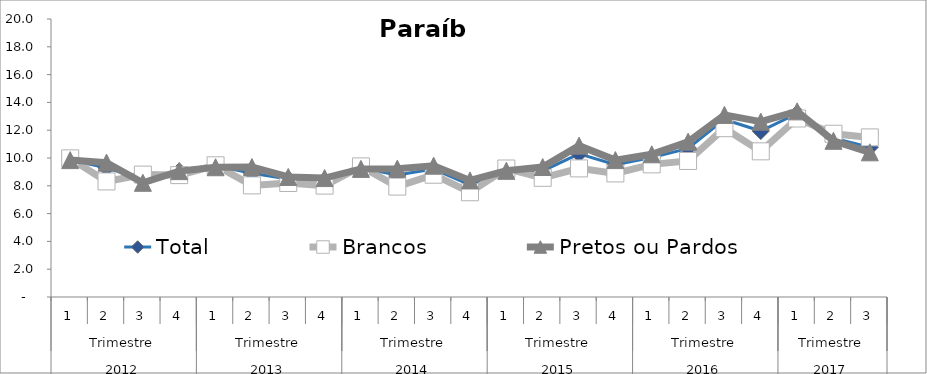
| Category | Total | Brancos | Pretos ou Pardos |
|---|---|---|---|
| 0 | 9.86 | 9.975 | 9.848 |
| 1 | 9.291 | 8.313 | 9.665 |
| 2 | 8.462 | 8.805 | 8.216 |
| 3 | 9.045 | 8.768 | 9.055 |
| 4 | 9.434 | 9.475 | 9.335 |
| 5 | 8.91 | 8.029 | 9.35 |
| 6 | 8.483 | 8.203 | 8.637 |
| 7 | 8.397 | 8.014 | 8.555 |
| 8 | 9.287 | 9.396 | 9.217 |
| 9 | 8.772 | 7.943 | 9.233 |
| 10 | 9.208 | 8.797 | 9.446 |
| 11 | 8.075 | 7.537 | 8.386 |
| 12 | 9.146 | 9.245 | 9.078 |
| 13 | 9.073 | 8.575 | 9.351 |
| 14 | 10.301 | 9.252 | 10.887 |
| 15 | 9.511 | 8.889 | 9.849 |
| 16 | 10.03 | 9.544 | 10.264 |
| 17 | 10.695 | 9.787 | 11.168 |
| 18 | 12.773 | 12.144 | 13.098 |
| 19 | 11.94 | 10.48 | 12.612 |
| 20 | 13.209 | 12.841 | 13.355 |
| 21 | 11.425 | 11.744 | 11.237 |
| 22 | 10.777 | 11.482 | 10.409 |